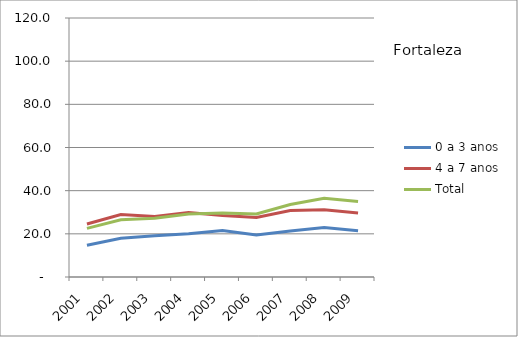
| Category | 0 a 3 anos | 4 a 7 anos | Total |
|---|---|---|---|
| 2001.0 | 14.73 | 24.53 | 22.53 |
| 2002.0 | 17.95 | 28.97 | 26.52 |
| 2003.0 | 19.08 | 28.03 | 27.22 |
| 2004.0 | 20 | 29.9 | 29.16 |
| 2005.0 | 21.58 | 28.49 | 29.62 |
| 2006.0 | 19.5 | 27.56 | 29.17 |
| 2007.0 | 21.36 | 30.84 | 33.57 |
| 2008.0 | 22.89 | 31.13 | 36.43 |
| 2009.0 | 21.43 | 29.64 | 34.94 |